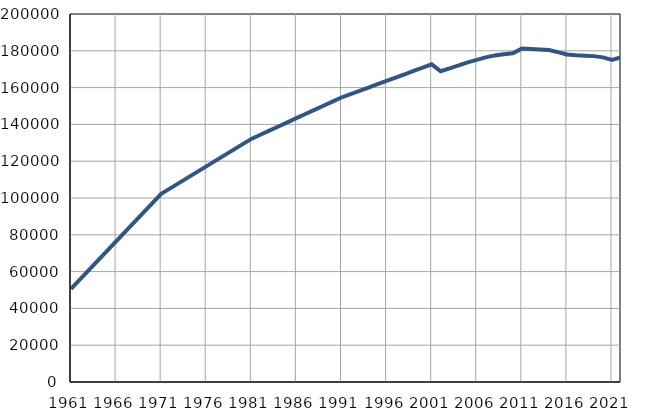
| Category | Population
size |
|---|---|
| 1961.0 | 50581 |
| 1962.0 | 55748 |
| 1963.0 | 60916 |
| 1964.0 | 66083 |
| 1965.0 | 71250 |
| 1966.0 | 76418 |
| 1967.0 | 81585 |
| 1968.0 | 86752 |
| 1969.0 | 91919 |
| 1970.0 | 97087 |
| 1971.0 | 102254 |
| 1972.0 | 105241 |
| 1973.0 | 108228 |
| 1974.0 | 111215 |
| 1975.0 | 114202 |
| 1976.0 | 117189 |
| 1977.0 | 120175 |
| 1978.0 | 123162 |
| 1979.0 | 126149 |
| 1980.0 | 129136 |
| 1981.0 | 132123 |
| 1982.0 | 134374 |
| 1983.0 | 136625 |
| 1984.0 | 138876 |
| 1985.0 | 141127 |
| 1986.0 | 143378 |
| 1987.0 | 145628 |
| 1988.0 | 147879 |
| 1989.0 | 150130 |
| 1990.0 | 152381 |
| 1991.0 | 154632 |
| 1992.0 | 156435 |
| 1993.0 | 158238 |
| 1994.0 | 160042 |
| 1995.0 | 161845 |
| 1996.0 | 163648 |
| 1997.0 | 165451 |
| 1998.0 | 167254 |
| 1999.0 | 169057 |
| 2000.0 | 170861 |
| 2001.0 | 172664 |
| 2002.0 | 168889 |
| 2003.0 | 170408 |
| 2004.0 | 172108 |
| 2005.0 | 173748 |
| 2006.0 | 175076 |
| 2007.0 | 176436 |
| 2008.0 | 177490 |
| 2009.0 | 178154 |
| 2010.0 | 178637 |
| 2011.0 | 181186 |
| 2012.0 | 180999 |
| 2013.0 | 180725 |
| 2014.0 | 180455 |
| 2015.0 | 179293 |
| 2016.0 | 178009 |
| 2017.0 | 177586 |
| 2018.0 | 177338 |
| 2019.0 | 177108 |
| 2020.0 | 176429 |
| 2021.0 | 175056 |
| 2022.0 | 176420 |